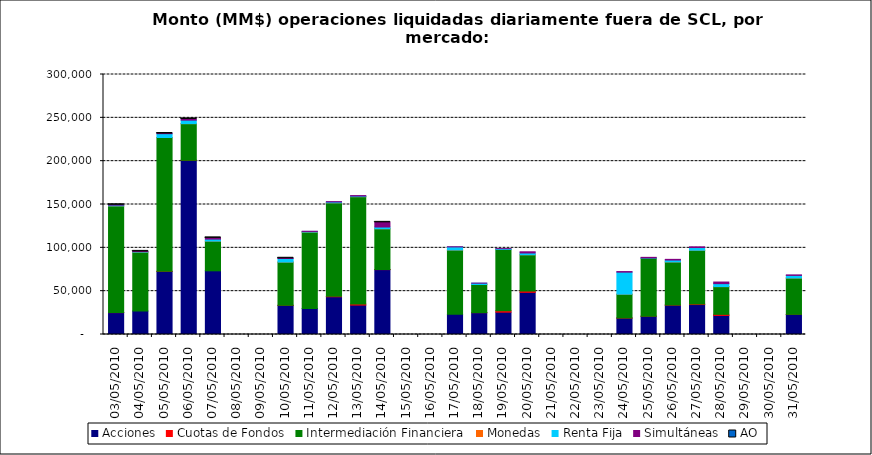
| Category | Acciones | Cuotas de Fondos | Intermediación Financiera | Monedas | Renta Fija | Simultáneas | AO |
|---|---|---|---|---|---|---|---|
| 03/05/2010 | 25247.607 | 11.929 | 123139.392 | 3.57 | 851.272 | 403.64 | 0.031 |
| 04/05/2010 | 27038.011 | 0 | 68043.518 | 3.6 | 610.327 | 193.377 | 0.015 |
| 05/05/2010 | 72807.603 | 91.831 | 154393.103 | 4.32 | 4428.897 | 171.944 | 0.015 |
| 06/05/2010 | 200994.965 | 4.658 | 42286.122 | 1.08 | 4041.136 | 1375.681 | 0.118 |
| 07/05/2010 | 73477.649 | 0 | 34280.353 | 10.044 | 2305.391 | 1384.281 | 0.092 |
| 10/05/2010 | 33612.248 | 82.99 | 49852.2 | 3.24 | 4122.129 | 269.64 | 0.002 |
| 11/05/2010 | 29978.097 | 0 | 88212.239 | 11.716 | 726.511 | 195.702 | 0 |
| 12/05/2010 | 43560.036 | 437.978 | 107964.689 | 1.095 | 982.848 | 358.636 | 0 |
| 13/05/2010 | 33963.024 | 1261.527 | 123790.106 | 25.55 | 718.988 | 538.346 | 0 |
| 14/05/2010 | 74867.908 | 119.985 | 47013.722 | 16.435 | 2005.572 | 5366.255 | 5.684 |
| 17/05/2010 | 23422.434 | 0 | 74051.244 | 14.601 | 3580.996 | 157.348 | 0 |
| 18/05/2010 | 25222.339 | 11.416 | 32448.914 | 1.825 | 1528.885 | 61.402 | 0 |
| 19/05/2010 | 25768.062 | 1759.666 | 70619.458 | 0 | 845.469 | 80.949 | 0 |
| 20/05/2010 | 48640.438 | 1519.497 | 41832.307 | 12.085 | 2070.397 | 1364.422 | 0 |
| 24/05/2010 | 18911.508 | 167.009 | 27399.487 | 20.068 | 25450.788 | 673.178 | 0 |
| 25/05/2010 | 21068.374 | 5.5 | 67022.769 | 0 | 276.182 | 649.232 | 0 |
| 26/05/2010 | 33867.688 | 164.577 | 49660.553 | 5.11 | 2222.202 | 781.381 | 0 |
| 27/05/2010 | 34568.411 | 592.659 | 62043.783 | 15.145 | 3118.394 | 824.736 | 0 |
| 28/05/2010 | 22026.215 | 1224.779 | 31999.796 | 1.46 | 3435.945 | 1852.581 | 0 |
| 31/05/2010 | 23174.398 | 58.301 | 41935.006 | 0.91 | 3003.406 | 607.92 | 0 |